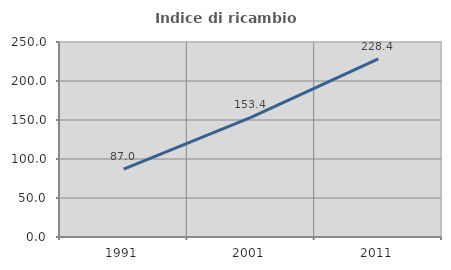
| Category | Indice di ricambio occupazionale  |
|---|---|
| 1991.0 | 86.957 |
| 2001.0 | 153.425 |
| 2011.0 | 228.378 |